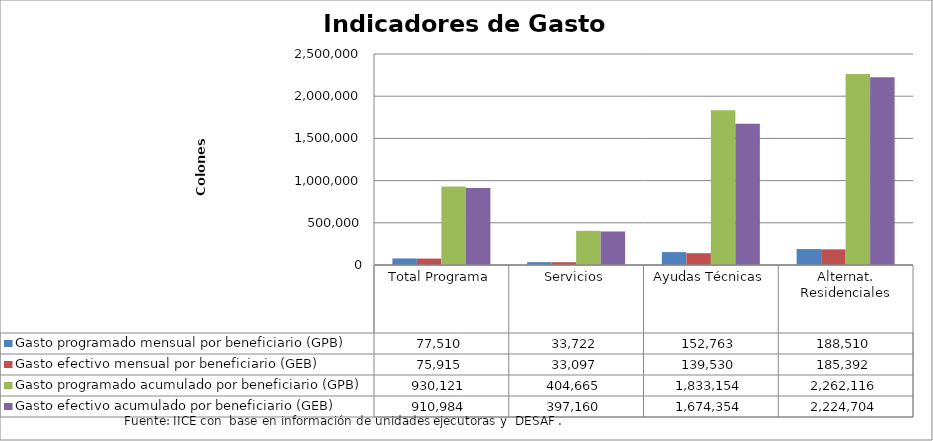
| Category | Gasto programado mensual por beneficiario (GPB)  | Gasto efectivo mensual por beneficiario (GEB)  | Gasto programado acumulado por beneficiario (GPB)  | Gasto efectivo acumulado por beneficiario (GEB)  |
|---|---|---|---|---|
| Total Programa | 77510.115 | 75915.298 | 930121.382 | 910983.571 |
| Servicios | 33722.119 | 33096.674 | 404665.431 | 397160.085 |
| Ayudas Técnicas | 152762.848 | 139529.527 | 1833154.179 | 1674354.324 |
| Alternat. Residenciales | 188509.694 | 185392.023 | 2262116.324 | 2224704.281 |